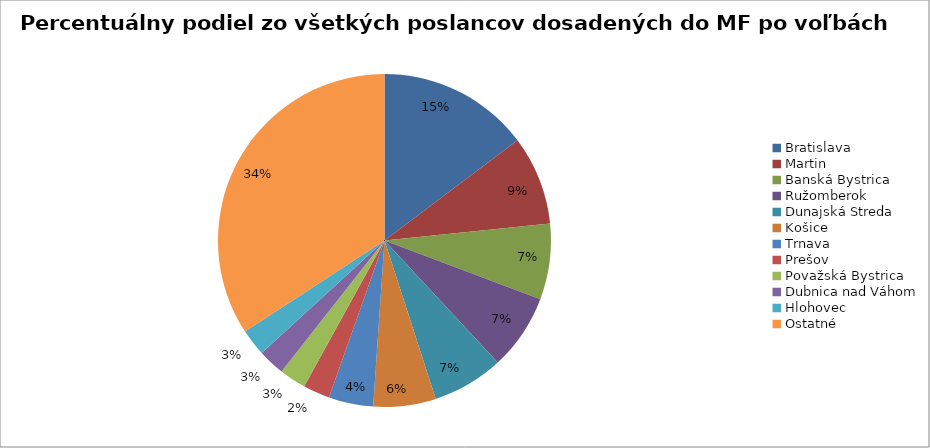
| Category | Percentuálny podiel zo všetkých poslancov dosadených do MF po voľbách 2010 |
|---|---|
| Bratislava | 0.147 |
| Martin | 0.087 |
| Banská Bystrica | 0.074 |
| Ružomberok | 0.074 |
| Dunajská Streda | 0.069 |
| Košice | 0.061 |
| Trnava | 0.043 |
| Prešov | 0.026 |
| Považská Bystrica | 0.026 |
| Dubnica nad Váhom | 0.026 |
| Hlohovec | 0.026 |
| Ostatné | 0.342 |